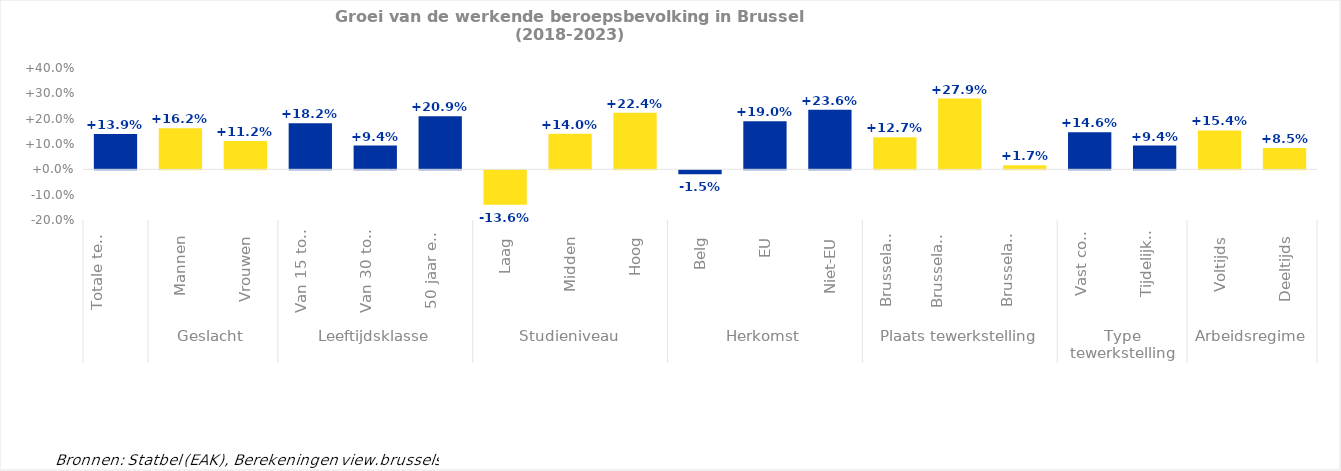
| Category | % |
|---|---|
| 0 | 0.139 |
| 1 | 0.162 |
| 2 | 0.112 |
| 3 | 0.182 |
| 4 | 0.094 |
| 5 | 0.209 |
| 6 | -0.136 |
| 7 | 0.14 |
| 8 | 0.224 |
| 9 | -0.015 |
| 10 | 0.19 |
| 11 | 0.236 |
| 12 | 0.127 |
| 13 | 0.279 |
| 14 | 0.017 |
| 15 | 0.146 |
| 16 | 0.094 |
| 17 | 0.154 |
| 18 | 0.085 |